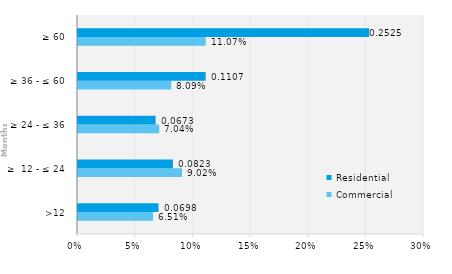
| Category | Commercial | Residential |
|---|---|---|
| >12 | 0.065 | 0.07 |
| ≥  12 - ≤ 24 | 0.09 | 0.082 |
| ≥ 24 - ≤ 36 | 0.07 | 0.067 |
| ≥ 36 - ≤ 60 | 0.081 | 0.111 |
| ≥ 60 | 0.111 | 0.252 |